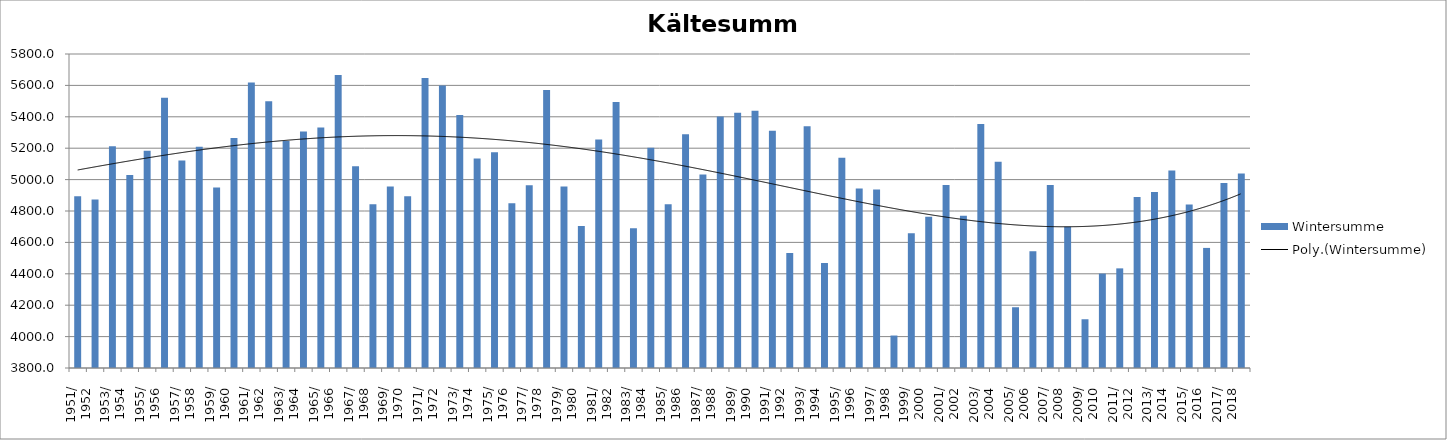
| Category | Wintersumme |
|---|---|
| 1951/
1952 | 4894 |
| 1952/
1953 | 4873.7 |
| 1953/
1954 | 5211.8 |
| 1954/
1955 | 5028.7 |
| 1955/
1956 | 5183.7 |
| 1956/
1957 | 5521.9 |
| 1957/
1958 | 5121.3 |
| 1958/
1959 | 5208.9 |
| 1959/
1960 | 4949.6 |
| 1960/
1961 | 5264.8 |
| 1961/
1962 | 5617.8 |
| 1962/
1963 | 5498.7 |
| 1963/
1964 | 5246.5 |
| 1964/
1965 | 5306.1 |
| 1965/
1966 | 5331.6 |
| 1966/
1967 | 5666.4 |
| 1967/
1968 | 5085.5 |
| 1968/
1969 | 4843.5 |
| 1969/
1970 | 4955.7 |
| 1970/
1971 | 4893.2 |
| 1971/
1972 | 5646.5 |
| 1972/
1973 | 5599 |
| 1973/
1974 | 5412.2 |
| 1974/
1975 | 5134.5 |
| 1975/
1976 | 5175 |
| 1976/
1977 | 4848.7 |
| 1977/
1978 | 4963.3 |
| 1978/
1979 | 5570.3 |
| 1979/
1980 | 4955.6 |
| 1980/
1981 | 4704.1 |
| 1981/
1982 | 5255.5 |
| 1982/
1983 | 5494.4 |
| 1983/
1984 | 4690.5 |
| 1984/
1985 | 5203.5 |
| 1985/
1986 | 4842.8 |
| 1986/
1987 | 5288.3 |
| 1987/
1988 | 5032.6 |
| 1988/
1989 | 5401.5 |
| 1989/
1990 | 5425.9 |
| 1990/
1991 | 5439.2 |
| 1991/
1992 | 5310.4 |
| 1992/
1993 | 4532.6 |
| 1993/
1994 | 5339.2 |
| 1994/
1995 | 4468.7 |
| 1995/
1996 | 5139.7 |
| 1996/
1997 | 4943.2 |
| 1997/
1998 | 4936.8 |
| 1998/
1999 | 4006.8 |
| 1999/
2000 | 4658.1 |
| 2000/
2001 | 4762.6 |
| 2001/
2002 | 4966.4 |
| 2002/
2003 | 4770.5 |
| 2003/
2004 | 5354.6 |
| 2004/
2005 | 5113.1 |
| 2005/
2006 | 4187 |
| 2006/
2007 | 4543.7 |
| 2007/
2008 | 4965.1 |
| 2008/
2009 | 4699.5 |
| 2009/
2010 | 4110.5 |
| 2010/
2011 | 4401.3 |
| 2011/
2012 | 4434.6 |
| 2012/
2013 | 4888.9 |
| 2013/
2014 | 4921 |
| 2014/
2015 | 5058 |
| 2015/
2016 | 4841.9 |
| 2016/
2017 | 4564.9 |
| 2017/
2018 | 4978.1 |
| 2018/
2019 | 5039.2 |